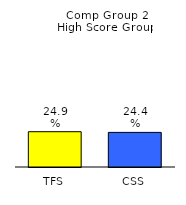
| Category | Series 0 |
|---|---|
| TFS | 0.249 |
| CSS | 0.244 |